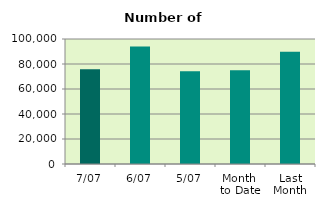
| Category | Series 0 |
|---|---|
| 7/07 | 75858 |
| 6/07 | 94074 |
| 5/07 | 74244 |
| Month 
to Date | 74994 |
| Last
Month | 89884.909 |